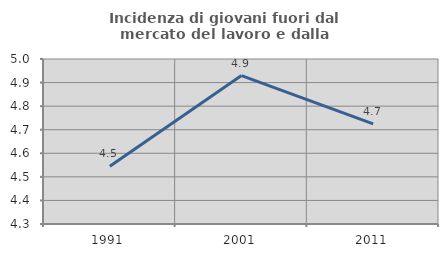
| Category | Incidenza di giovani fuori dal mercato del lavoro e dalla formazione  |
|---|---|
| 1991.0 | 4.545 |
| 2001.0 | 4.93 |
| 2011.0 | 4.724 |